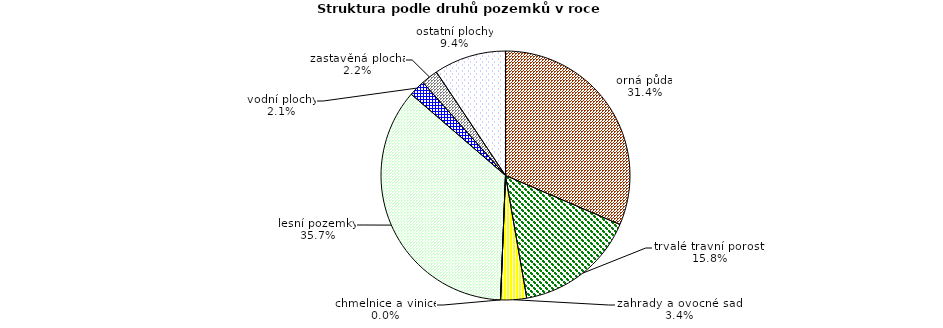
| Category | Struktura druhů pozemků |
|---|---|
| orná půda | 170630.066 |
| trvalé travní porosty | 85890.429 |
| zahrady a ovocné sady | 18281.095 |
| chmelnice a vinice | 0.078 |
| lesní pozemky | 193678.68 |
| vodní plochy | 11540.094 |
| zastavěná plocha | 11796.994 |
| ostatní plochy | 50893.119 |